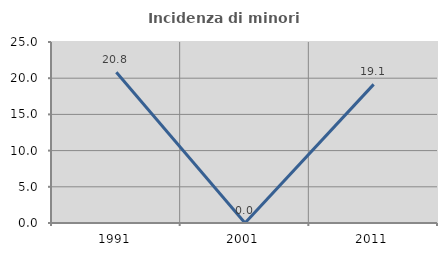
| Category | Incidenza di minori stranieri |
|---|---|
| 1991.0 | 20.833 |
| 2001.0 | 0 |
| 2011.0 | 19.149 |